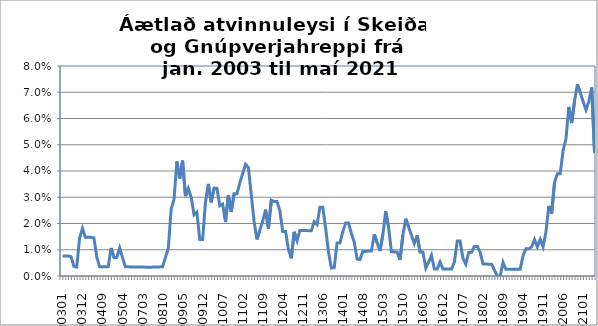
| Category | Series 0 |
|---|---|
| 200301 | 0.008 |
| 200302 | 0.008 |
| 200303 | 0.008 |
| 200304 | 0.007 |
| 200305 | 0.004 |
| 200308 | 0.003 |
| 200311 | 0.014 |
| 200312 | 0.018 |
| 200401 | 0.015 |
| 200402 | 0.015 |
| 200403 | 0.015 |
| 200404 | 0.014 |
| 200405 | 0.007 |
| 200407 | 0.004 |
| 200409 | 0.004 |
| 200410 | 0.004 |
| 200411 | 0.004 |
| 200412 | 0.011 |
| 200501 | 0.007 |
| 200502 | 0.007 |
| 200503 | 0.011 |
| 200504 | 0.007 |
| 200505 | 0.003 |
| 200506 | 0.003 |
| 200611 | 0.003 |
| 200612 | 0.003 |
| 200701 | 0.003 |
| 200702 | 0.003 |
| 200703 | 0.003 |
| 200705 | 0.003 |
| 200706 | 0.003 |
| 200709 | 0.003 |
| 200710 | 0.003 |
| 200711 | 0.003 |
| 200712 | 0.003 |
| 200810 | 0.004 |
| 200811 | 0.007 |
| 200812 | 0.011 |
| 200901 | 0.025 |
| 200902 | 0.029 |
| 200903 | 0.044 |
| 200904 | 0.037 |
| 200905 | 0.044 |
| 200906 | 0.03 |
| 200907 | 0.033 |
| 200908 | 0.03 |
| 200909 | 0.023 |
| 200910 | 0.024 |
| 200911 | 0.014 |
| 200912 | 0.014 |
| 201001 | 0.028 |
| 201002 | 0.035 |
| 201003 | 0.028 |
| 201004 | 0.033 |
| 201005 | 0.033 |
| 201006 | 0.027 |
| 201007 | 0.027 |
| 201008 | 0.021 |
| 201009 | 0.031 |
| 201010 | 0.024 |
| 201011 | 0.031 |
| 201012 | 0.031 |
| 201101 | 0.035 |
| 201102 | 0.039 |
| 201103 | 0.043 |
| 201104 | 0.041 |
| 201105 | 0.031 |
| 201106 | 0.021 |
| 201107 | 0.014 |
| 201108 | 0.017 |
| 201109 | 0.021 |
| 201110 | 0.025 |
| 201111 | 0.018 |
| 201112 | 0.029 |
| 201201 | 0.028 |
| 201202 | 0.028 |
| 201203 | 0.025 |
| 201204 | 0.017 |
| 201205 | 0.017 |
| 201206 | 0.01 |
| 201207 | 0.007 |
| 201208 | 0.017 |
| 201209 | 0.013 |
| 201210 | 0.017 |
| 201211 | 0.017 |
| 201212 | 0.017 |
| 201301 | 0.017 |
| 201302 | 0.017 |
| 201303 | 0.021 |
| 201304 | 0.02 |
| 201305 | 0.026 |
| 201306 | 0.026 |
| 201307 | 0.018 |
| 201308 | 0.009 |
| 201309 | 0.003 |
| 201310 | 0.003 |
| 201311 | 0.013 |
| 201312 | 0.013 |
| 201401 | 0.017 |
| 201402 | 0.02 |
| 201403 | 0.02 |
| 201404 | 0.016 |
| 201405 | 0.013 |
| 201406 | 0.006 |
| 201407 | 0.006 |
| 201408 | 0.009 |
| 201409 | 0.009 |
| 201410 | 0.01 |
| 201411 | 0.01 |
| 201412 | 0.016 |
| 2001501 | 0.013 |
| 201502 | 0.009 |
| 201503 | 0.016 |
| 201504 | 0.025 |
| 201505 | 0.019 |
| 201506 | 0.009 |
| 201507 | 0.009 |
| 201508 | 0.009 |
| 201509 | 0.006 |
| 201510 | 0.016 |
| 201511 | 0.022 |
| 201512 | 0.019 |
| 201601 | 0.015 |
| 201602 | 0.012 |
| 201603 | 0.015 |
| 201604 | 0.009 |
| 201605 | 0.009 |
| 201606 | 0.003 |
| 201607 | 0.005 |
| 201608 | 0.008 |
| 201609 | 0.003 |
| 201610 | 0.003 |
| 201611 | 0.005 |
| 201612 | 0.003 |
| 201701 | 0.003 |
| 201702 | 0.003 |
| 201703 | 0.003 |
| 201704 | 0.005 |
| 201705 | 0.013 |
| 201706 | 0.013 |
| 201707 | 0.007 |
| 201708 | 0.004 |
| 201709 | 0.009 |
| 201710 | 0.009 |
| 201711 | 0.011 |
| 201712 | 0.011 |
| 201801 | 0.009 |
| 201802 | 0.005 |
| 201803 | 0.005 |
| 201804 | 0.004 |
| 201805 | 0.004 |
| 201806 | 0.002 |
| 201807 | 0 |
| 201808 | 0 |
| 201809 | 0.005 |
| 201810 | 0.003 |
| 201811 | 0.003 |
| 201812 | 0.003 |
| 201901 | 0.003 |
| 201902 | 0.003 |
| 201903 | 0.003 |
| 201904 | 0.008 |
| 201905 | 0.01 |
| 201906 | 0.01 |
| 201907 | 0.011 |
| 201908 | 0.014 |
| 201909 | 0.011 |
| 201910 | 0.014 |
| 201911 | 0.011 |
| 201912 | 0.017 |
| 202001 | 0.027 |
| 202002 | 0.024 |
| 202003 | 0.036 |
| 202004 | 0.039 |
| 202005 | 0.039 |
| 202006 | 0.048 |
| 202007 | 0.052 |
| 202008 | 0.064 |
| 202009 | 0.058 |
| 202010 | 0.067 |
| 202011 | 0.073 |
| 202012 | 0.07 |
| 202101 | 0.066 |
| 202102 | 0.063 |
| 202103 | 0.066 |
| 202104 | 0.072 |
| 202105 | 0.047 |